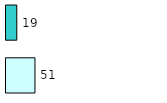
| Category | Series 0 | Series 1 |
|---|---|---|
| 0 | 51 | 19 |